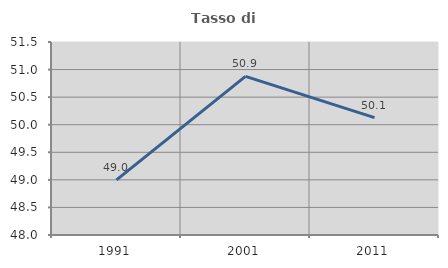
| Category | Tasso di occupazione   |
|---|---|
| 1991.0 | 49 |
| 2001.0 | 50.877 |
| 2011.0 | 50.13 |